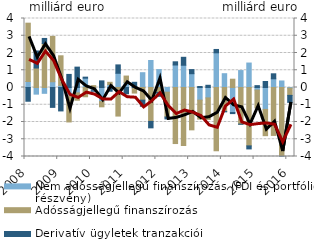
| Category | Nem adósságjellegű finanszírozás (FDI és portfólió részvény) | Adósságjellegű finanszírozás | Derivatív ügyletek tranzakciói |
|---|---|---|---|
| 2008.0 | 0.348 | 3.381 | -0.797 |
| 2008.0 | -0.385 | 1.131 | 0.986 |
| 2008.0 | -0.338 | 2.551 | 0.292 |
| 2008.0 | 0.334 | 2.628 | -1.152 |
| 2009.0 | 0.125 | 1.714 | -1.358 |
| 2009.0 | -0.495 | -1.502 | 0.758 |
| 2009.0 | -0.31 | -0.426 | 1.181 |
| 2009.0 | 0.54 | -0.537 | 0.06 |
| 2010.0 | -0.188 | 0.108 | -0.028 |
| 2010.0 | -0.819 | -0.301 | 0.384 |
| 2010.0 | 0.167 | 0.134 | -0.216 |
| 2010.0 | 0.825 | -1.656 | 0.485 |
| 2011.0 | 0.28 | 0.384 | -0.362 |
| 2011.0 | -0.045 | -0.279 | 0.301 |
| 2011.0 | 0.858 | -0.734 | -0.355 |
| 2011.0 | 1.566 | -1.967 | -0.372 |
| 2012.0 | 1.038 | -0.282 | -0.228 |
| 2012.0 | -0.271 | -1.439 | -0.112 |
| 2012.0 | 1.304 | -3.249 | 0.185 |
| 2012.0 | 1.29 | -3.363 | 0.461 |
| 2013.0 | 0.8 | -2.455 | 0.238 |
| 2013.0 | -0.732 | -1.101 | 0.057 |
| 2013.0 | -0.602 | -1.25 | 0.129 |
| 2013.0 | 2.011 | -3.667 | 0.193 |
| 2014.0 | 0.8 | -1.395 | -0.015 |
| 2014.0 | -1.451 | 0.481 | -0.062 |
| 2014.0 | 0.982 | -2.12 | -0.012 |
| 2014.0 | 1.418 | -3.385 | -0.175 |
| 2015.0 | -0.149 | -1.04 | 0.108 |
| 2015.0 | -1.27 | -1.524 | 0.349 |
| 2015.0 | 0.506 | -2.778 | 0.289 |
| 2015.0 | 0.378 | -4.031 | -0.059 |
| 2016.0 | -0.037 | -0.419 | -0.406 |